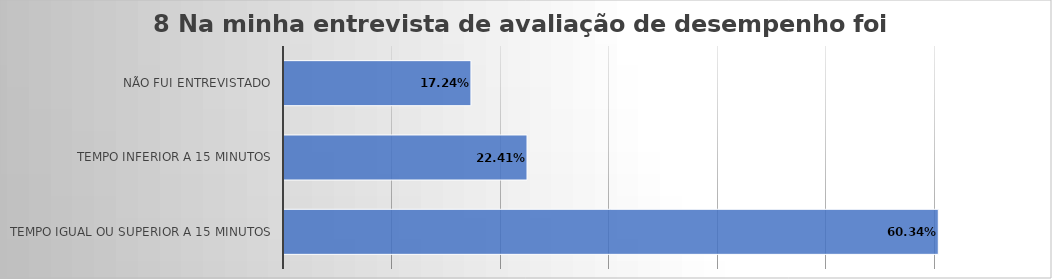
| Category | 8 Na minha entrevista de avaliação de desempenho foi utilizado: |
|---|---|
| Tempo igual ou superior a 15 minutos | 0.603 |
| Tempo inferior a 15 minutos | 0.224 |
| Não fui entrevistado | 0.172 |